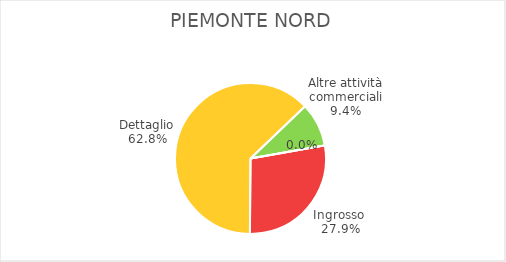
| Category | Piemonte Nord |
|---|---|
| Ingrosso  | 1667 |
| Dettaglio | 3747 |
| Altre attività commerciali | 560 |